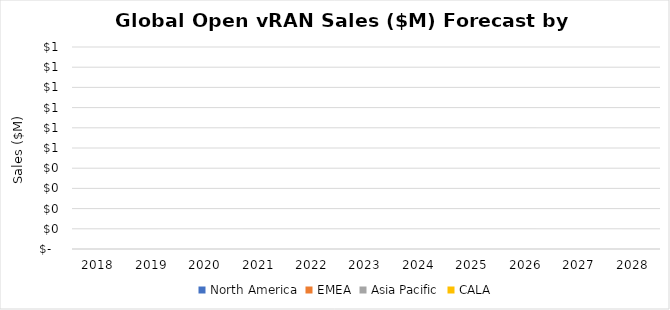
| Category | North America | EMEA | Asia Pacific | CALA |
|---|---|---|---|---|
| 2018.0 | 0 | 0 | 0 | 0 |
| 2019.0 | 0 | 0 | 0 | 0 |
| 2020.0 | 0 | 0 | 0 | 0 |
| 2021.0 | 0 | 0 | 0 | 0 |
| 2022.0 | 0 | 0 | 0 | 0 |
| 2023.0 | 0 | 0 | 0 | 0 |
| 2024.0 | 0 | 0 | 0 | 0 |
| 2025.0 | 0 | 0 | 0 | 0 |
| 2026.0 | 0 | 0 | 0 | 0 |
| 2027.0 | 0 | 0 | 0 | 0 |
| 2028.0 | 0 | 0 | 0 | 0 |